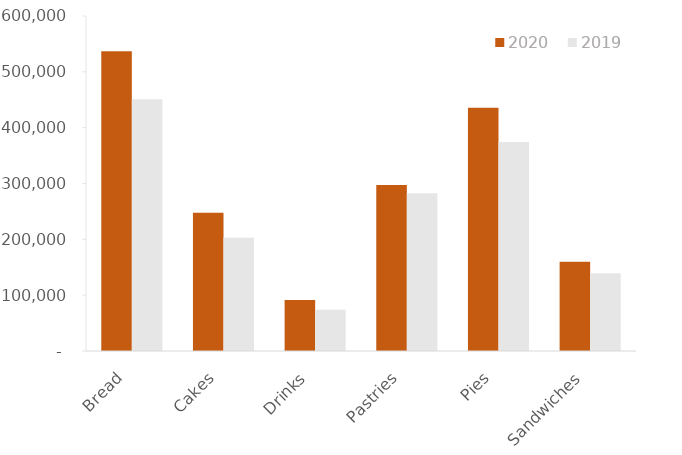
| Category | 2020  | 2019  |
|---|---|---|
|  Bread  | 536978 | 451061.52 |
|  Cakes  | 247550 | 202991 |
|  Drinks  | 91356 | 73998.36 |
|  Pastries  | 297320 | 282454 |
|  Pies  | 435486 | 374517.96 |
|  Sandwiches  | 159866 | 139083.42 |